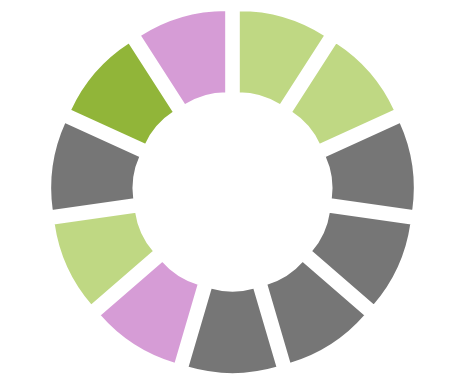
| Category | Series 0 |
|---|---|
| 0 | 0 |
| 1 | 1 |
| 2 | 0 |
| 3 | 0 |
| 4 | 0 |
| 5 | 0 |
| 6 | 0 |
| 7 | 1 |
| 8 | 0 |
| 9 | 0 |
| 10 | 0 |
| 11 | 0 |
| 12 | 0 |
| 13 | 0 |
| 14 | 1 |
| 15 | 0 |
| 16 | 0 |
| 17 | 0 |
| 18 | 0 |
| 19 | 0 |
| 20 | 1 |
| 21 | 0 |
| 22 | 0 |
| 23 | 0 |
| 24 | 0 |
| 25 | 0 |
| 26 | 1 |
| 27 | 0 |
| 28 | 0 |
| 29 | 0 |
| 30 | 0 |
| 31 | 0 |
| 32 | 1 |
| 33 | 0 |
| 34 | 0 |
| 35 | 0 |
| 36 | 0 |
| 37 | 0 |
| 38 | 0 |
| 39 | 1 |
| 40 | 0 |
| 41 | 0 |
| 42 | 0 |
| 43 | 1 |
| 44 | 0 |
| 45 | 0 |
| 46 | 0 |
| 47 | 0 |
| 48 | 0 |
| 49 | 0 |
| 50 | 1 |
| 51 | 0 |
| 52 | 0 |
| 53 | 0 |
| 54 | 1 |
| 55 | 0 |
| 56 | 0 |
| 57 | 0 |
| 58 | 0 |
| 59 | 0 |
| 60 | 0 |
| 61 | 0 |
| 62 | 0 |
| 63 | 1 |
| 64 | 0 |
| 65 | 0 |